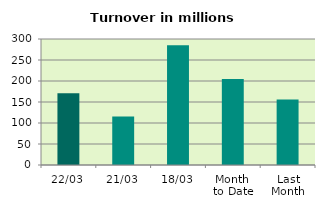
| Category | Series 0 |
|---|---|
| 22/03 | 171.068 |
| 21/03 | 115.21 |
| 18/03 | 285.204 |
| Month 
to Date | 204.519 |
| Last
Month | 156.222 |